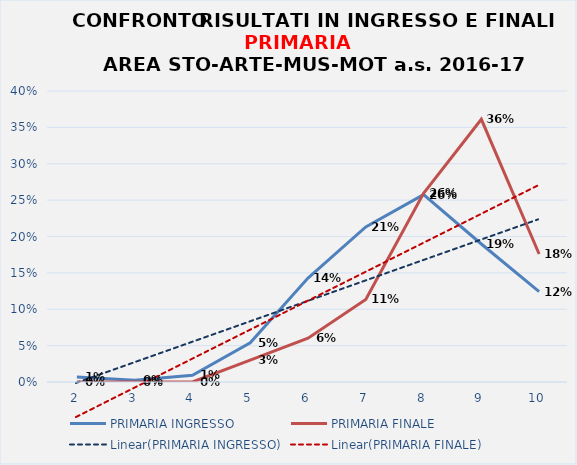
| Category | PRIMARIA INGRESSO | PRIMARIA FINALE |
|---|---|---|
| 2.0 | 0.007 | 0 |
| 3.0 | 0.002 | 0 |
| 4.0 | 0.009 | 0 |
| 5.0 | 0.054 | 0.03 |
| 6.0 | 0.143 | 0.06 |
| 7.0 | 0.213 | 0.113 |
| 8.0 | 0.258 | 0.259 |
| 9.0 | 0.19 | 0.361 |
| 10.0 | 0.124 | 0.176 |